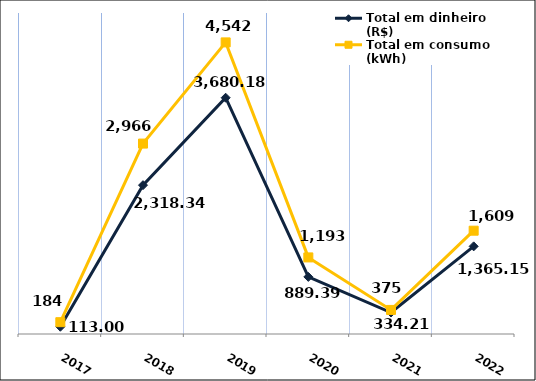
| Category | Total em dinheiro (R$) |
|---|---|
| 2017.0 | 113 |
| 2018.0 | 2318.34 |
| 2019.0 | 3680.18 |
| 2020.0 | 889.39 |
| 2021.0 | 334.21 |
| 2022.0 | 1365.15 |